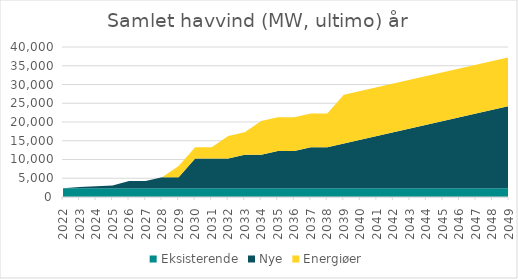
| Category | Eksisterende | Nye | Energiøer |
|---|---|---|---|
| 2022.0 | 2305.6 | 0 | 0 |
| 2023.0 | 2305.6 | 350 | 0 |
| 2024.0 | 2305.6 | 540 | 0 |
| 2025.0 | 2305.6 | 745 | 0 |
| 2026.0 | 2300.6 | 1950 | 0 |
| 2027.0 | 2300.6 | 1950 | 0 |
| 2028.0 | 2300.6 | 2950 | 0 |
| 2029.0 | 2300.6 | 2950 | 3000 |
| 2030.0 | 2300.6 | 7950 | 3000 |
| 2031.0 | 2300.6 | 7950 | 3000 |
| 2032.0 | 2300.6 | 7950 | 6000 |
| 2033.0 | 2300.6 | 8950 | 6000 |
| 2034.0 | 2300.6 | 8950 | 9000 |
| 2035.0 | 2300.6 | 9950 | 9000 |
| 2036.0 | 2300.6 | 9950 | 9000 |
| 2037.0 | 2300.6 | 10950 | 9000 |
| 2038.0 | 2300.6 | 10950 | 9000 |
| 2039.0 | 2300.6 | 11950 | 13000 |
| 2040.0 | 2300.6 | 12950 | 13000 |
| 2041.0 | 2300.6 | 13950 | 13000 |
| 2042.0 | 2300.6 | 14950 | 13000 |
| 2043.0 | 2300.6 | 15950 | 13000 |
| 2044.0 | 2300.6 | 16950 | 13000 |
| 2045.0 | 2300.6 | 17950 | 13000 |
| 2046.0 | 2300.6 | 18950 | 13000 |
| 2047.0 | 2300.6 | 19950 | 13000 |
| 2048.0 | 2300.6 | 20950 | 13000 |
| 2049.0 | 2300.6 | 21950 | 13000 |